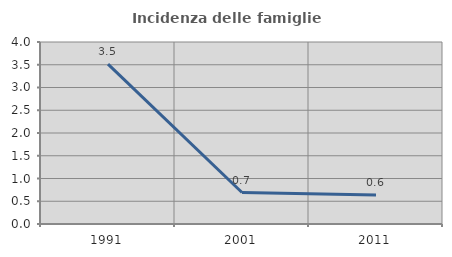
| Category | Incidenza delle famiglie numerose |
|---|---|
| 1991.0 | 3.513 |
| 2001.0 | 0.692 |
| 2011.0 | 0.638 |